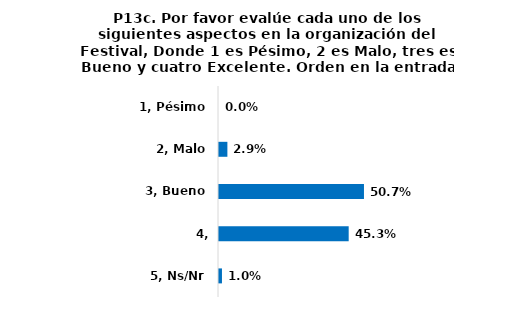
| Category | Series 0 |
|---|---|
| 1, Pésimo | 0 |
| 2, Malo | 0.029 |
| 3, Bueno | 0.507 |
| 4, Excelente | 0.453 |
| 5, Ns/Nr | 0.01 |